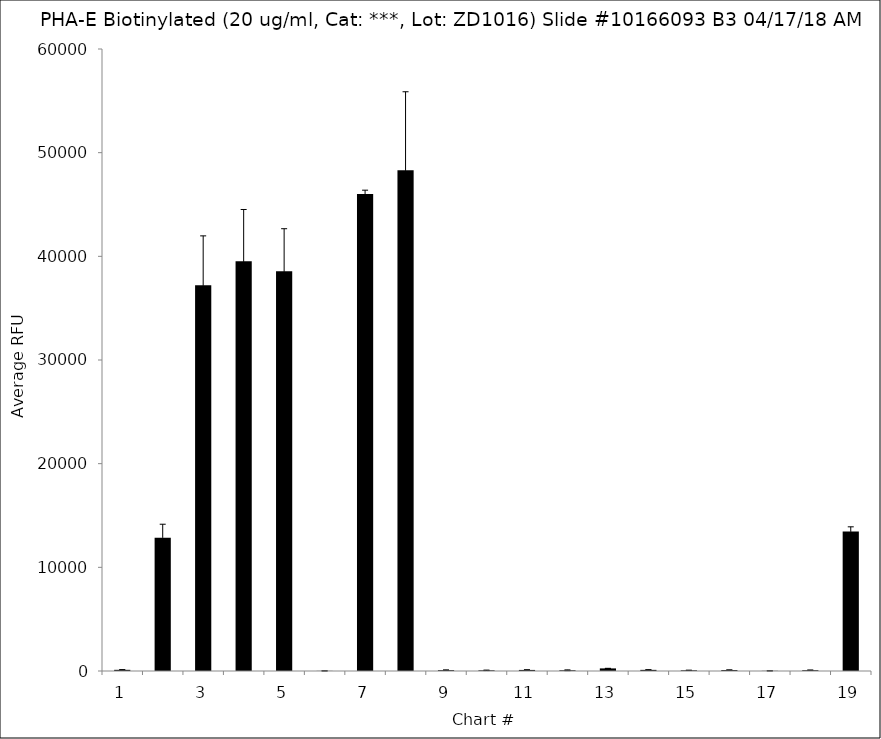
| Category | Series 0 |
|---|---|
| 1.0 | 113.5 |
| 2.0 | 12850.25 |
| 3.0 | 37198.75 |
| 4.0 | 39533.5 |
| 5.0 | 38549.75 |
| 6.0 | 11.25 |
| 7.0 | 46008.5 |
| 8.0 | 48293.25 |
| 9.0 | 80.75 |
| 10.0 | 64.5 |
| 11.0 | 103.5 |
| 12.0 | 69.75 |
| 13.0 | 250.5 |
| 14.0 | 109.5 |
| 15.0 | 66.5 |
| 16.0 | 92.25 |
| 17.0 | 14.75 |
| 18.0 | 76.25 |
| 19.0 | 13453 |